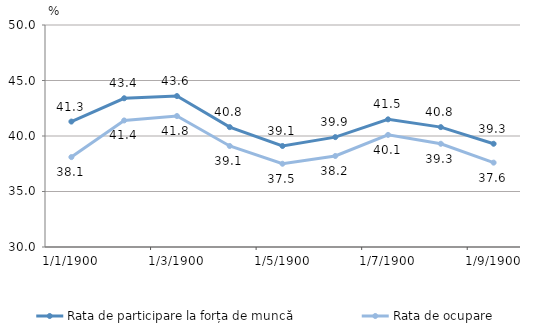
| Category | Rata de participare la forța de muncă | Rata de ocupare |
|---|---|---|
| 0 | 41.3 | 38.1 |
| 1 | 43.4 | 41.4 |
| 2 | 43.6 | 41.8 |
| 3 | 40.8 | 39.1 |
| 4 | 39.1 | 37.5 |
| 5 | 39.9 | 38.2 |
| 6 | 41.5 | 40.1 |
| 7 | 40.8 | 39.3 |
| 8 | 39.3 | 37.6 |